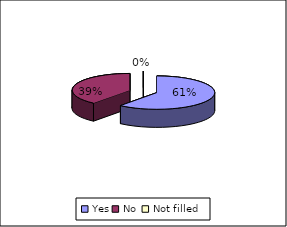
| Category | Did your GP offer you a choice of where you could have your treatment |
|---|---|
| Yes | 59 |
| No  | 38 |
| Not filled | 0 |